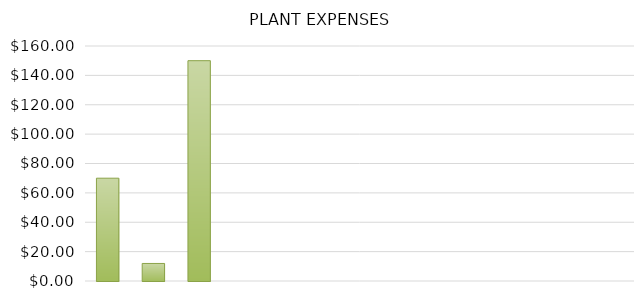
| Category | Rhododendron |
|---|---|
| Rhododendron | 70 |
| Petunia | 11.94 |
| Japanese Maple | 150 |